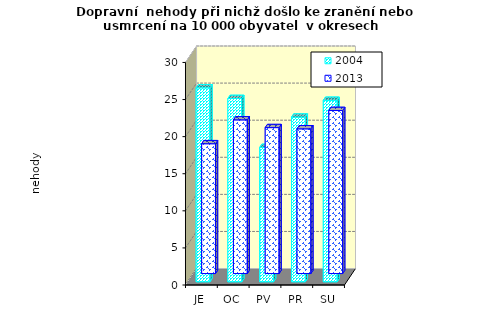
| Category | 2004 | 2013 |
|---|---|---|
| JE | 26.139 | 17.498 |
| OC | 24.706 | 20.714 |
| PV | 18.111 | 19.67 |
| PR | 22.191 | 19.506 |
| SU | 24.46 | 21.975 |